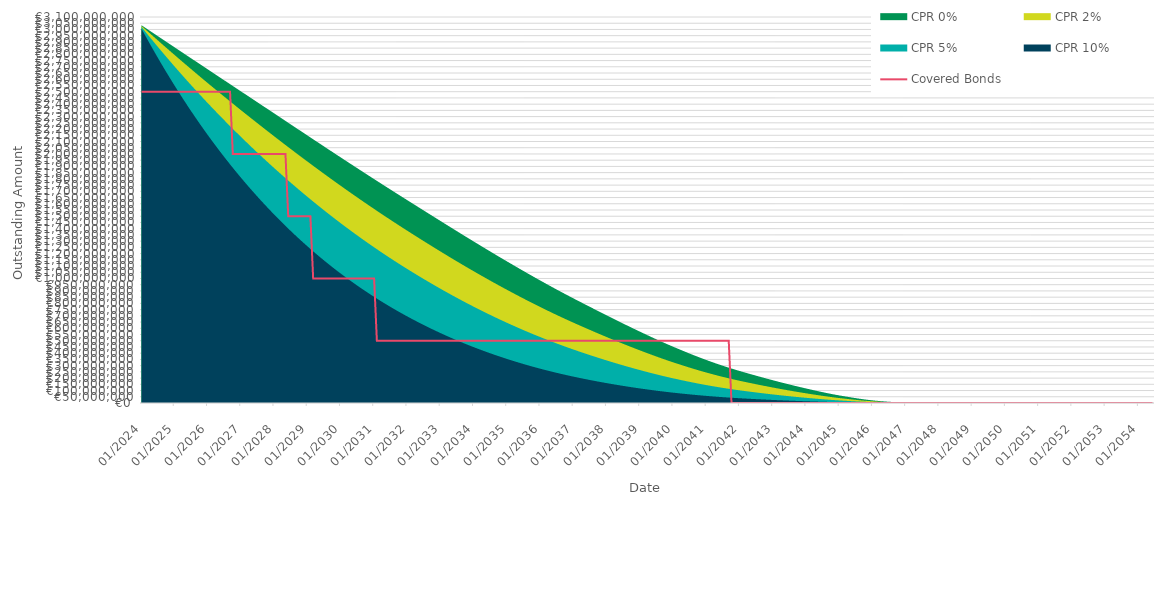
| Category | Covered Bonds |
|---|---|
| 2024-01-31 | 2500000000 |
| 2024-02-29 | 2500000000 |
| 2024-03-31 | 2500000000 |
| 2024-04-30 | 2500000000 |
| 2024-05-31 | 2500000000 |
| 2024-06-30 | 2500000000 |
| 2024-07-31 | 2500000000 |
| 2024-08-31 | 2500000000 |
| 2024-09-30 | 2500000000 |
| 2024-10-31 | 2500000000 |
| 2024-11-30 | 2500000000 |
| 2024-12-31 | 2500000000 |
| 2025-01-31 | 2500000000 |
| 2025-02-28 | 2500000000 |
| 2025-03-31 | 2500000000 |
| 2025-04-30 | 2500000000 |
| 2025-05-31 | 2500000000 |
| 2025-06-30 | 2500000000 |
| 2025-07-31 | 2500000000 |
| 2025-08-31 | 2500000000 |
| 2025-09-30 | 2500000000 |
| 2025-10-31 | 2500000000 |
| 2025-11-30 | 2500000000 |
| 2025-12-31 | 2500000000 |
| 2026-01-31 | 2500000000 |
| 2026-02-28 | 2500000000 |
| 2026-03-31 | 2500000000 |
| 2026-04-30 | 2500000000 |
| 2026-05-31 | 2500000000 |
| 2026-06-30 | 2500000000 |
| 2026-07-31 | 2500000000 |
| 2026-08-31 | 2500000000 |
| 2026-09-30 | 2500000000 |
| 2026-10-31 | 2000000000 |
| 2026-11-30 | 2000000000 |
| 2026-12-31 | 2000000000 |
| 2027-01-31 | 2000000000 |
| 2027-02-28 | 2000000000 |
| 2027-03-31 | 2000000000 |
| 2027-04-30 | 2000000000 |
| 2027-05-31 | 2000000000 |
| 2027-06-30 | 2000000000 |
| 2027-07-31 | 2000000000 |
| 2027-08-31 | 2000000000 |
| 2027-09-30 | 2000000000 |
| 2027-10-31 | 2000000000 |
| 2027-11-30 | 2000000000 |
| 2027-12-31 | 2000000000 |
| 2028-01-31 | 2000000000 |
| 2028-02-29 | 2000000000 |
| 2028-03-31 | 2000000000 |
| 2028-04-30 | 2000000000 |
| 2028-05-31 | 2000000000 |
| 2028-06-30 | 1500000000 |
| 2028-07-31 | 1500000000 |
| 2028-08-31 | 1500000000 |
| 2028-09-30 | 1500000000 |
| 2028-10-31 | 1500000000 |
| 2028-11-30 | 1500000000 |
| 2028-12-31 | 1500000000 |
| 2029-01-31 | 1500000000 |
| 2029-02-28 | 1500000000 |
| 2029-03-31 | 1000000000 |
| 2029-04-30 | 1000000000 |
| 2029-05-31 | 1000000000 |
| 2029-06-30 | 1000000000 |
| 2029-07-31 | 1000000000 |
| 2029-08-31 | 1000000000 |
| 2029-09-30 | 1000000000 |
| 2029-10-31 | 1000000000 |
| 2029-11-30 | 1000000000 |
| 2029-12-31 | 1000000000 |
| 2030-01-31 | 1000000000 |
| 2030-02-28 | 1000000000 |
| 2030-03-31 | 1000000000 |
| 2030-04-30 | 1000000000 |
| 2030-05-31 | 1000000000 |
| 2030-06-30 | 1000000000 |
| 2030-07-31 | 1000000000 |
| 2030-08-31 | 1000000000 |
| 2030-09-30 | 1000000000 |
| 2030-10-31 | 1000000000 |
| 2030-11-30 | 1000000000 |
| 2030-12-31 | 1000000000 |
| 2031-01-31 | 1000000000 |
| 2031-02-28 | 500000000 |
| 2031-03-31 | 500000000 |
| 2031-04-30 | 500000000 |
| 2031-05-31 | 500000000 |
| 2031-06-30 | 500000000 |
| 2031-07-31 | 500000000 |
| 2031-08-31 | 500000000 |
| 2031-09-30 | 500000000 |
| 2031-10-31 | 500000000 |
| 2031-11-30 | 500000000 |
| 2031-12-31 | 500000000 |
| 2032-01-31 | 500000000 |
| 2032-02-29 | 500000000 |
| 2032-03-31 | 500000000 |
| 2032-04-30 | 500000000 |
| 2032-05-31 | 500000000 |
| 2032-06-30 | 500000000 |
| 2032-07-31 | 500000000 |
| 2032-08-31 | 500000000 |
| 2032-09-30 | 500000000 |
| 2032-10-31 | 500000000 |
| 2032-11-30 | 500000000 |
| 2032-12-31 | 500000000 |
| 2033-01-31 | 500000000 |
| 2033-02-28 | 500000000 |
| 2033-03-31 | 500000000 |
| 2033-04-30 | 500000000 |
| 2033-05-31 | 500000000 |
| 2033-06-30 | 500000000 |
| 2033-07-31 | 500000000 |
| 2033-08-31 | 500000000 |
| 2033-09-30 | 500000000 |
| 2033-10-31 | 500000000 |
| 2033-11-30 | 500000000 |
| 2033-12-31 | 500000000 |
| 2034-01-31 | 500000000 |
| 2034-02-28 | 500000000 |
| 2034-03-31 | 500000000 |
| 2034-04-30 | 500000000 |
| 2034-05-31 | 500000000 |
| 2034-06-30 | 500000000 |
| 2034-07-31 | 500000000 |
| 2034-08-31 | 500000000 |
| 2034-09-30 | 500000000 |
| 2034-10-31 | 500000000 |
| 2034-11-30 | 500000000 |
| 2034-12-31 | 500000000 |
| 2035-01-31 | 500000000 |
| 2035-02-28 | 500000000 |
| 2035-03-31 | 500000000 |
| 2035-04-30 | 500000000 |
| 2035-05-31 | 500000000 |
| 2035-06-30 | 500000000 |
| 2035-07-31 | 500000000 |
| 2035-08-31 | 500000000 |
| 2035-09-30 | 500000000 |
| 2035-10-31 | 500000000 |
| 2035-11-30 | 500000000 |
| 2035-12-31 | 500000000 |
| 2036-01-31 | 500000000 |
| 2036-02-29 | 500000000 |
| 2036-03-31 | 500000000 |
| 2036-04-30 | 500000000 |
| 2036-05-31 | 500000000 |
| 2036-06-30 | 500000000 |
| 2036-07-31 | 500000000 |
| 2036-08-31 | 500000000 |
| 2036-09-30 | 500000000 |
| 2036-10-31 | 500000000 |
| 2036-11-30 | 500000000 |
| 2036-12-31 | 500000000 |
| 2037-01-31 | 500000000 |
| 2037-02-28 | 500000000 |
| 2037-03-31 | 500000000 |
| 2037-04-30 | 500000000 |
| 2037-05-31 | 500000000 |
| 2037-06-30 | 500000000 |
| 2037-07-31 | 500000000 |
| 2037-08-31 | 500000000 |
| 2037-09-30 | 500000000 |
| 2037-10-31 | 500000000 |
| 2037-11-30 | 500000000 |
| 2037-12-31 | 500000000 |
| 2038-01-31 | 500000000 |
| 2038-02-28 | 500000000 |
| 2038-03-31 | 500000000 |
| 2038-04-30 | 500000000 |
| 2038-05-31 | 500000000 |
| 2038-06-30 | 500000000 |
| 2038-07-31 | 500000000 |
| 2038-08-31 | 500000000 |
| 2038-09-30 | 500000000 |
| 2038-10-31 | 500000000 |
| 2038-11-30 | 500000000 |
| 2038-12-31 | 500000000 |
| 2039-01-31 | 500000000 |
| 2039-02-28 | 500000000 |
| 2039-03-31 | 500000000 |
| 2039-04-30 | 500000000 |
| 2039-05-31 | 500000000 |
| 2039-06-30 | 500000000 |
| 2039-07-31 | 500000000 |
| 2039-08-31 | 500000000 |
| 2039-09-30 | 500000000 |
| 2039-10-31 | 500000000 |
| 2039-11-30 | 500000000 |
| 2039-12-31 | 500000000 |
| 2040-01-31 | 500000000 |
| 2040-02-29 | 500000000 |
| 2040-03-31 | 500000000 |
| 2040-04-30 | 500000000 |
| 2040-05-31 | 500000000 |
| 2040-06-30 | 500000000 |
| 2040-07-31 | 500000000 |
| 2040-08-31 | 500000000 |
| 2040-09-30 | 500000000 |
| 2040-10-31 | 500000000 |
| 2040-11-30 | 500000000 |
| 2040-12-31 | 500000000 |
| 2041-01-31 | 500000000 |
| 2041-02-28 | 500000000 |
| 2041-03-31 | 500000000 |
| 2041-04-30 | 500000000 |
| 2041-05-31 | 500000000 |
| 2041-06-30 | 500000000 |
| 2041-07-31 | 500000000 |
| 2041-08-31 | 500000000 |
| 2041-09-30 | 500000000 |
| 2041-10-31 | 0 |
| 2041-11-30 | 0 |
| 2041-12-31 | 0 |
| 2042-01-31 | 0 |
| 2042-02-28 | 0 |
| 2042-03-31 | 0 |
| 2042-04-30 | 0 |
| 2042-05-31 | 0 |
| 2042-06-30 | 0 |
| 2042-07-31 | 0 |
| 2042-08-31 | 0 |
| 2042-09-30 | 0 |
| 2042-10-31 | 0 |
| 2042-11-30 | 0 |
| 2042-12-31 | 0 |
| 2043-01-31 | 0 |
| 2043-02-28 | 0 |
| 2043-03-31 | 0 |
| 2043-04-30 | 0 |
| 2043-05-31 | 0 |
| 2043-06-30 | 0 |
| 2043-07-31 | 0 |
| 2043-08-31 | 0 |
| 2043-09-30 | 0 |
| 2043-10-31 | 0 |
| 2043-11-30 | 0 |
| 2043-12-31 | 0 |
| 2044-01-31 | 0 |
| 2044-02-29 | 0 |
| 2044-03-31 | 0 |
| 2044-04-30 | 0 |
| 2044-05-31 | 0 |
| 2044-06-30 | 0 |
| 2044-07-31 | 0 |
| 2044-08-31 | 0 |
| 2044-09-30 | 0 |
| 2044-10-31 | 0 |
| 2044-11-30 | 0 |
| 2044-12-31 | 0 |
| 2045-01-31 | 0 |
| 2045-02-28 | 0 |
| 2045-03-31 | 0 |
| 2045-04-30 | 0 |
| 2045-05-31 | 0 |
| 2045-06-30 | 0 |
| 2045-07-31 | 0 |
| 2045-08-31 | 0 |
| 2045-09-30 | 0 |
| 2045-10-31 | 0 |
| 2045-11-30 | 0 |
| 2045-12-31 | 0 |
| 2046-01-31 | 0 |
| 2046-02-28 | 0 |
| 2046-03-31 | 0 |
| 2046-04-30 | 0 |
| 2046-05-31 | 0 |
| 2046-06-30 | 0 |
| 2046-07-31 | 0 |
| 2046-08-31 | 0 |
| 2046-09-30 | 0 |
| 2046-10-31 | 0 |
| 2046-11-30 | 0 |
| 2046-12-31 | 0 |
| 2047-01-31 | 0 |
| 2047-02-28 | 0 |
| 2047-03-31 | 0 |
| 2047-04-30 | 0 |
| 2047-05-31 | 0 |
| 2047-06-30 | 0 |
| 2047-07-31 | 0 |
| 2047-08-31 | 0 |
| 2047-09-30 | 0 |
| 2047-10-31 | 0 |
| 2047-11-30 | 0 |
| 2047-12-31 | 0 |
| 2048-01-31 | 0 |
| 2048-02-29 | 0 |
| 2048-03-31 | 0 |
| 2048-04-30 | 0 |
| 2048-05-31 | 0 |
| 2048-06-30 | 0 |
| 2048-07-31 | 0 |
| 2048-08-31 | 0 |
| 2048-09-30 | 0 |
| 2048-10-31 | 0 |
| 2048-11-30 | 0 |
| 2048-12-31 | 0 |
| 2049-01-31 | 0 |
| 2049-02-28 | 0 |
| 2049-03-31 | 0 |
| 2049-04-30 | 0 |
| 2049-05-31 | 0 |
| 2049-06-30 | 0 |
| 2049-07-31 | 0 |
| 2049-08-31 | 0 |
| 2049-09-30 | 0 |
| 2049-10-31 | 0 |
| 2049-11-30 | 0 |
| 2049-12-31 | 0 |
| 2050-01-31 | 0 |
| 2050-02-28 | 0 |
| 2050-03-31 | 0 |
| 2050-04-30 | 0 |
| 2050-05-31 | 0 |
| 2050-06-30 | 0 |
| 2050-07-31 | 0 |
| 2050-08-31 | 0 |
| 2050-09-30 | 0 |
| 2050-10-31 | 0 |
| 2050-11-30 | 0 |
| 2050-12-31 | 0 |
| 2051-01-31 | 0 |
| 2051-02-28 | 0 |
| 2051-03-31 | 0 |
| 2051-04-30 | 0 |
| 2051-05-31 | 0 |
| 2051-06-30 | 0 |
| 2051-07-31 | 0 |
| 2051-08-31 | 0 |
| 2051-09-30 | 0 |
| 2051-10-31 | 0 |
| 2051-11-30 | 0 |
| 2051-12-31 | 0 |
| 2052-01-31 | 0 |
| 2052-02-29 | 0 |
| 2052-03-31 | 0 |
| 2052-04-30 | 0 |
| 2052-05-31 | 0 |
| 2052-06-30 | 0 |
| 2052-07-31 | 0 |
| 2052-08-31 | 0 |
| 2052-09-30 | 0 |
| 2052-10-31 | 0 |
| 2052-11-30 | 0 |
| 2052-12-31 | 0 |
| 2053-01-31 | 0 |
| 2053-02-28 | 0 |
| 2053-03-31 | 0 |
| 2053-04-30 | 0 |
| 2053-05-31 | 0 |
| 2053-06-30 | 0 |
| 2053-07-31 | 0 |
| 2053-08-31 | 0 |
| 2053-09-30 | 0 |
| 2053-10-31 | 0 |
| 2053-11-30 | 0 |
| 2053-12-31 | 0 |
| 2054-01-31 | 0 |
| 2054-02-28 | 0 |
| 2054-03-31 | 0 |
| 2054-04-30 | 0 |
| 2054-05-31 | 0 |
| 2054-06-30 | 0 |